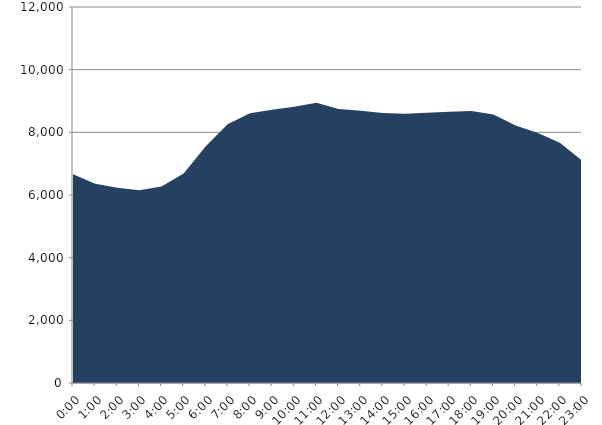
| Category | Series 0 | Series 1 |
|---|---|---|
| 2022-07-20 |  | 6664.49 |
| 2022-07-20 01:00:00 |  | 6356.35 |
| 2022-07-20 02:00:00 |  | 6233.32 |
| 2022-07-20 03:00:00 |  | 6152.58 |
| 2022-07-20 04:00:00 |  | 6271.1 |
| 2022-07-20 05:00:00 |  | 6687.63 |
| 2022-07-20 06:00:00 |  | 7555.2 |
| 2022-07-20 07:00:00 |  | 8263.95 |
| 2022-07-20 08:00:00 |  | 8607.83 |
| 2022-07-20 09:00:00 |  | 8722.93 |
| 2022-07-20 10:00:00 |  | 8819.18 |
| 2022-07-20 11:00:00 |  | 8941.73 |
| 2022-07-20 12:00:00 |  | 8745.65 |
| 2022-07-20 13:00:00 |  | 8691.12 |
| 2022-07-20 14:00:00 |  | 8613.36 |
| 2022-07-20 15:00:00 |  | 8596.1 |
| 2022-07-20 16:00:00 |  | 8628.34 |
| 2022-07-20 17:00:00 |  | 8655.05 |
| 2022-07-20 18:00:00 |  | 8683.28 |
| 2022-07-20 19:00:00 |  | 8568.93 |
| 2022-07-20 20:00:00 |  | 8221.31 |
| 2022-07-20 21:00:00 |  | 7979.41 |
| 2022-07-20 22:00:00 |  | 7668.16 |
| 2022-07-20 23:00:00 |  | 7100.08 |